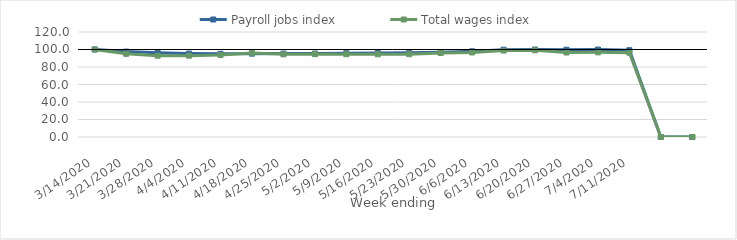
| Category | Payroll jobs index | Total wages index |
|---|---|---|
| 14/03/2020 | 100 | 100 |
| 21/03/2020 | 97.63 | 95.029 |
| 28/03/2020 | 96.189 | 92.906 |
| 04/04/2020 | 95.311 | 92.944 |
| 11/04/2020 | 95.104 | 93.594 |
| 18/04/2020 | 95.267 | 95.962 |
| 25/04/2020 | 95.34 | 94.492 |
| 02/05/2020 | 95.393 | 94.693 |
| 09/05/2020 | 95.794 | 94.621 |
| 16/05/2020 | 96.072 | 94.505 |
| 23/05/2020 | 96.264 | 94.616 |
| 30/05/2020 | 96.773 | 95.968 |
| 06/06/2020 | 97.913 | 96.615 |
| 13/06/2020 | 99.82 | 98.799 |
| 20/06/2020 | 99.945 | 99.118 |
| 27/06/2020 | 99.737 | 96.542 |
| 04/07/2020 | 99.923 | 96.736 |
| 11/07/2020 | 99.184 | 96.324 |